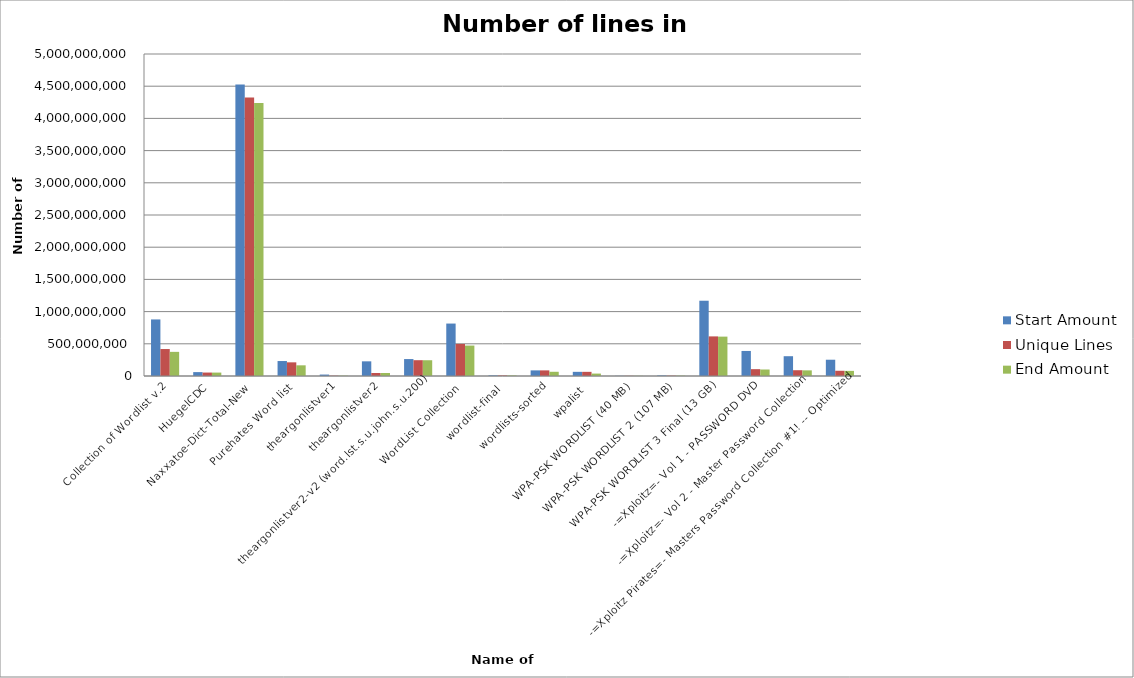
| Category | Start Amount | Unique Lines | End Amount |
|---|---|---|---|
| Collection of Wordlist v.2 | 878322828 | 418686815 | 374806023 |
| HuegelCDC | 60464518 | 53562138 | 53059218 |
| Naxxatoe-Dict-Total-New | 4526428471 | 4323879498 | 4239459985 |
| Purehates Word list | 232438150 | 212052412 | 165824917 |
| theargonlistver1 | 22349626 | 4904753 | 4865840 |
| theargonlistver2 | 227784242 | 46953874 | 46428068 |
| theargonlistver2-v2 (word.lst.s.u.john.s.u.200) | 263105855 | 245429886 | 244752784 |
| WordList Collection | 814369365 | 497893810 | 472603140 |
| wordlist-final | 9586053 | 8626868 | 8287890 |
| wordlists-sorted | 87289277 | 87289277 | 65581967 |
| wpalist | 64699999 | 64582824 | 37520637 |
| WPA-PSK WORDLIST (40 MB) | 2830423 | 2830080 | 2829412 |
| WPA-PSK WORDLIST 2 (107 MB) | 8545088 | 5209118 | 5062241 |
| WPA-PSK WORDLIST 3 Final (13 GB) | 1168830632 | 615078488 | 611419293 |
| -=Xploitz=- Vol 1 - PASSWORD DVD | 388922503 | 106192107 | 100944487 |
| -=Xploitz=- Vol 2 - Master Password Collection | 307344454 | 89842228 | 87565344 |
| -=Xploitz Pirates=- Masters Password Collection #1! -- Optimized | 252735303 | 81211635 | 79523622 |